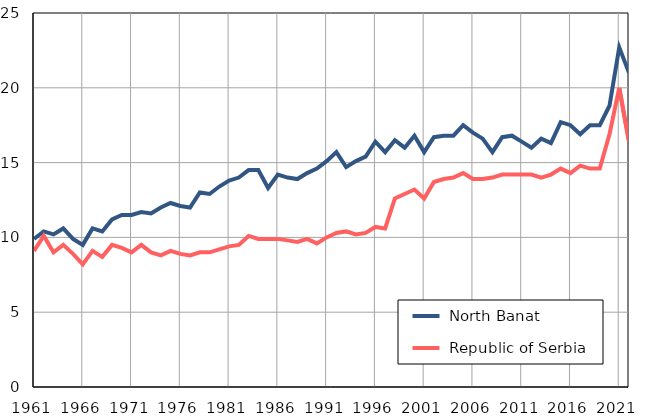
| Category |  North Banat |  Republic of Serbia |
|---|---|---|
| 1961.0 | 9.9 | 9.1 |
| 1962.0 | 10.4 | 10.1 |
| 1963.0 | 10.2 | 9 |
| 1964.0 | 10.6 | 9.5 |
| 1965.0 | 9.9 | 8.9 |
| 1966.0 | 9.5 | 8.2 |
| 1967.0 | 10.6 | 9.1 |
| 1968.0 | 10.4 | 8.7 |
| 1969.0 | 11.2 | 9.5 |
| 1970.0 | 11.5 | 9.3 |
| 1971.0 | 11.5 | 9 |
| 1972.0 | 11.7 | 9.5 |
| 1973.0 | 11.6 | 9 |
| 1974.0 | 12 | 8.8 |
| 1975.0 | 12.3 | 9.1 |
| 1976.0 | 12.1 | 8.9 |
| 1977.0 | 12 | 8.8 |
| 1978.0 | 13 | 9 |
| 1979.0 | 12.9 | 9 |
| 1980.0 | 13.4 | 9.2 |
| 1981.0 | 13.8 | 9.4 |
| 1982.0 | 14 | 9.5 |
| 1983.0 | 14.5 | 10.1 |
| 1984.0 | 14.5 | 9.9 |
| 1985.0 | 13.3 | 9.9 |
| 1986.0 | 14.2 | 9.9 |
| 1987.0 | 14 | 9.8 |
| 1988.0 | 13.9 | 9.7 |
| 1989.0 | 14.3 | 9.9 |
| 1990.0 | 14.6 | 9.6 |
| 1991.0 | 15.1 | 10 |
| 1992.0 | 15.7 | 10.3 |
| 1993.0 | 14.7 | 10.4 |
| 1994.0 | 15.1 | 10.2 |
| 1995.0 | 15.4 | 10.3 |
| 1996.0 | 16.4 | 10.7 |
| 1997.0 | 15.7 | 10.6 |
| 1998.0 | 16.5 | 12.6 |
| 1999.0 | 16 | 12.9 |
| 2000.0 | 16.8 | 13.2 |
| 2001.0 | 15.7 | 12.6 |
| 2002.0 | 16.7 | 13.7 |
| 2003.0 | 16.8 | 13.9 |
| 2004.0 | 16.8 | 14 |
| 2005.0 | 17.5 | 14.3 |
| 2006.0 | 17 | 13.9 |
| 2007.0 | 16.6 | 13.9 |
| 2008.0 | 15.7 | 14 |
| 2009.0 | 16.7 | 14.2 |
| 2010.0 | 16.8 | 14.2 |
| 2011.0 | 16.4 | 14.2 |
| 2012.0 | 16 | 14.2 |
| 2013.0 | 16.6 | 14 |
| 2014.0 | 16.3 | 14.2 |
| 2015.0 | 17.7 | 14.6 |
| 2016.0 | 17.5 | 14.3 |
| 2017.0 | 16.9 | 14.8 |
| 2018.0 | 17.5 | 14.6 |
| 2019.0 | 17.5 | 14.6 |
| 2020.0 | 18.8 | 16.9 |
| 2021.0 | 22.7 | 20 |
| 2022.0 | 21 | 16.4 |